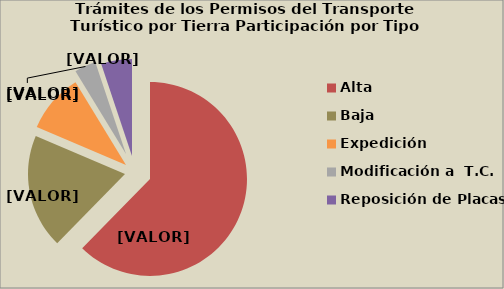
| Category | Series 0 |
|---|---|
| Alta                                         | 62.32 |
| Baja | 19.088 |
| Expedición | 9.875 |
| Modificación a  T.C. | 3.582 |
| Reposición de Placas | 5.135 |